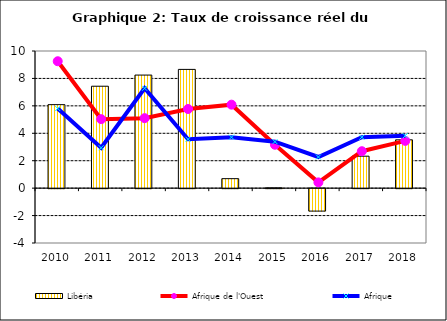
| Category | Libéria |
|---|---|
| 2010.0 | 6.088 |
| 2011.0 | 7.431 |
| 2012.0 | 8.245 |
| 2013.0 | 8.659 |
| 2014.0 | 0.691 |
| 2015.0 | 0.02 |
| 2016.0 | -1.637 |
| 2017.0 | 2.329 |
| 2018.0 | 3.524 |